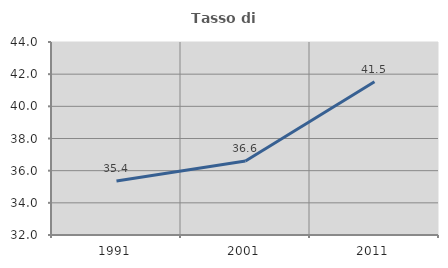
| Category | Tasso di occupazione   |
|---|---|
| 1991.0 | 35.352 |
| 2001.0 | 36.602 |
| 2011.0 | 41.525 |